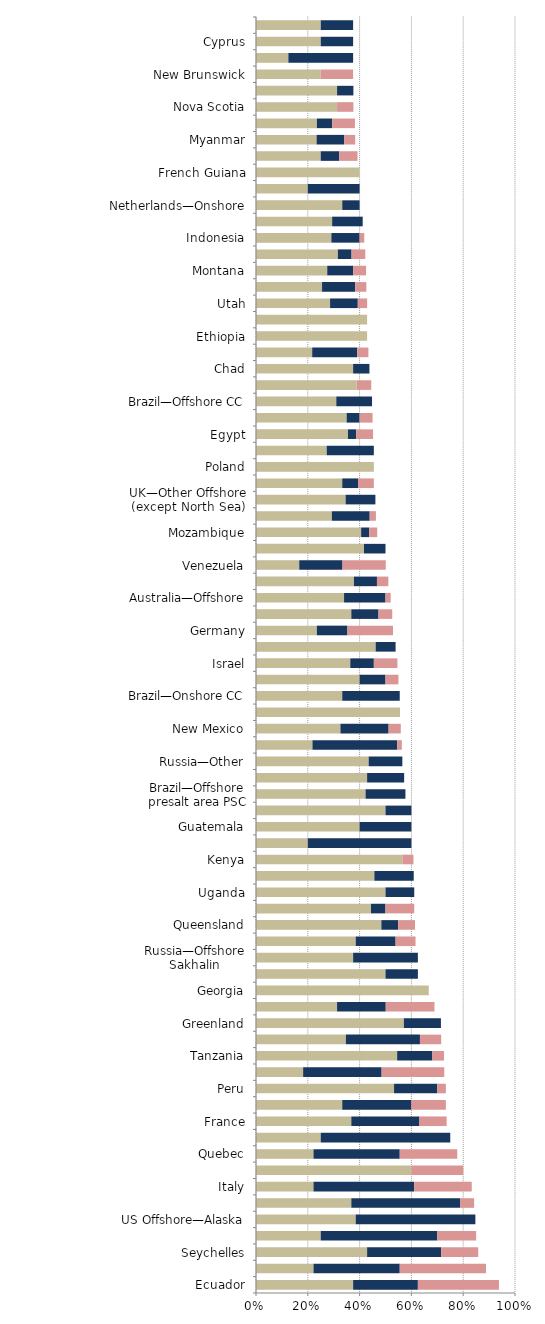
| Category |   Mild deterrent to investment |   Strong deterrent to investment |   Would not pursue investment due to this factor |
|---|---|---|---|
| Ecuador | 0.375 | 0.25 | 0.313 |
| US Offshore—Pacific | 0.222 | 0.333 | 0.333 |
| Seychelles | 0.429 | 0.286 | 0.143 |
| New South Wales | 0.25 | 0.45 | 0.15 |
| US Offshore—Alaska | 0.385 | 0.462 | 0 |
| Alaska | 0.368 | 0.421 | 0.053 |
| Italy | 0.222 | 0.389 | 0.222 |
| Greece | 0.6 | 0 | 0.2 |
| Quebec | 0.222 | 0.333 | 0.222 |
| Spain—Onshore | 0.25 | 0.5 | 0 |
| France | 0.368 | 0.263 | 0.105 |
| Spain—Offshore | 0.333 | 0.267 | 0.133 |
| Peru | 0.533 | 0.167 | 0.033 |
| California | 0.182 | 0.303 | 0.242 |
| Tanzania | 0.545 | 0.136 | 0.045 |
| Colorado | 0.347 | 0.286 | 0.082 |
| Greenland | 0.571 | 0.143 | 0 |
| New York | 0.313 | 0.188 | 0.188 |
| Georgia | 0.667 | 0 | 0 |
| Northwest Territories | 0.5 | 0.125 | 0 |
| Russia—Offshore Sakhalin | 0.375 | 0.25 | 0 |
| Bolivia | 0.385 | 0.154 | 0.077 |
| Queensland | 0.484 | 0.065 | 0.065 |
| Madagascar | 0.444 | 0.056 | 0.111 |
| Uganda | 0.5 | 0.111 | 0 |
| Colombia | 0.457 | 0.152 | 0 |
| Kenya | 0.565 | 0 | 0.043 |
| Uzbekistan | 0.2 | 0.4 | 0 |
| Guatemala | 0.4 | 0.2 | 0 |
| Russia—Offshore Arctic | 0.5 | 0.1 | 0 |
| Brazil—Offshore presalt area PSC | 0.423 | 0.154 | 0 |
| Yukon | 0.429 | 0.143 | 0 |
| Russia—Other | 0.435 | 0.13 | 0 |
| British Columbia | 0.218 | 0.327 | 0.018 |
| New Mexico | 0.326 | 0.186 | 0.047 |
| Hungary | 0.556 | 0 | 0 |
| Brazil—Onshore CC | 0.333 | 0.222 | 0 |
| South Africa | 0.4 | 0.1 | 0.05 |
| Israel | 0.364 | 0.091 | 0.091 |
| Ukraine | 0.462 | 0.077 | 0 |
| Germany | 0.235 | 0.118 | 0.176 |
| Victoria | 0.368 | 0.105 | 0.053 |
| Australia—Offshore | 0.34 | 0.16 | 0.02 |
| Western Australia | 0.378 | 0.089 | 0.044 |
| Venezuela | 0.167 | 0.167 | 0.167 |
| Bulgaria | 0.417 | 0.083 | 0 |
| Mozambique | 0.406 | 0.031 | 0.031 |
| New Zealand | 0.293 | 0.146 | 0.024 |
| UK—Other Offshore (except North Sea) | 0.346 | 0.115 | 0 |
| Pennsylvania | 0.333 | 0.061 | 0.061 |
| Poland | 0.455 | 0 | 0 |
| Russia—Eastern Siberia | 0.273 | 0.182 | 0 |
| Egypt | 0.355 | 0.032 | 0.065 |
| South Australia | 0.35 | 0.05 | 0.05 |
| Brazil—Offshore CC | 0.31 | 0.138 | 0 |
| Bangladesh | 0.389 | 0 | 0.056 |
| Chad | 0.375 | 0.063 | 0 |
| Norway—Other Offshore (except North Sea) | 0.217 | 0.174 | 0.043 |
| Ethiopia | 0.429 | 0 | 0 |
| Lebanon | 0.429 | 0 | 0 |
| Utah | 0.286 | 0.107 | 0.036 |
| Wyoming | 0.255 | 0.128 | 0.043 |
| Montana | 0.275 | 0.1 | 0.05 |
| Cameroon | 0.316 | 0.053 | 0.053 |
| Indonesia | 0.291 | 0.109 | 0.018 |
| Argentina—Mendoza | 0.294 | 0.118 | 0 |
| Netherlands—Onshore | 0.333 | 0.067 | 0 |
| Niger | 0.2 | 0.2 | 0 |
| French Guiana | 0.4 | 0 | 0 |
| Mexico | 0.25 | 0.071 | 0.071 |
| Myanmar | 0.234 | 0.106 | 0.043 |
| India | 0.235 | 0.059 | 0.088 |
| Nova Scotia | 0.313 | 0 | 0.063 |
| Chile | 0.313 | 0.063 | 0 |
| New Brunswick | 0.25 | 0 | 0.125 |
| Tasmania | 0.125 | 0.25 | 0 |
| Cyprus | 0.25 | 0.125 | 0 |
| Turkey | 0.25 | 0.125 | 0 |